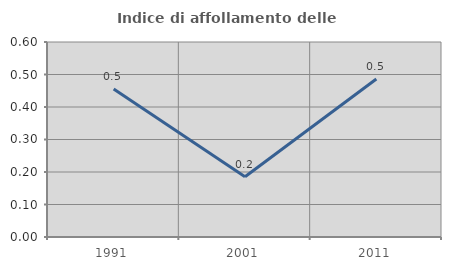
| Category | Indice di affollamento delle abitazioni  |
|---|---|
| 1991.0 | 0.456 |
| 2001.0 | 0.186 |
| 2011.0 | 0.486 |